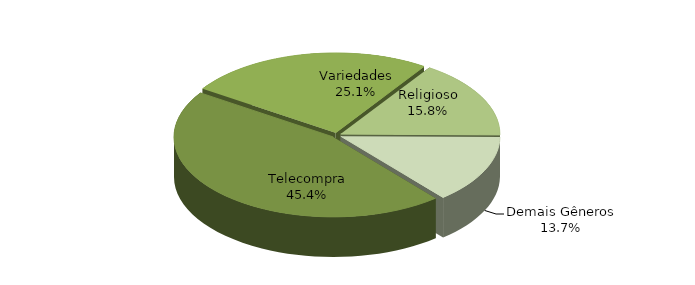
| Category | Series 0 |
|---|---|
| Telecompra | 0.454 |
| Variedades | 0.251 |
| Religioso | 0.158 |
| Demais Gêneros | 0.137 |